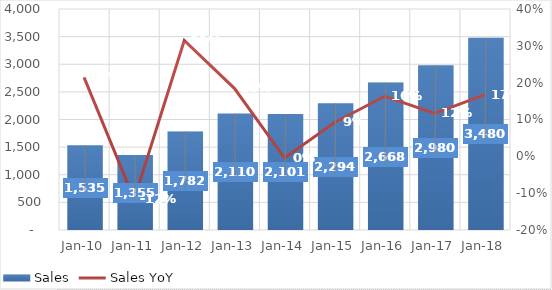
| Category | Sales |
|---|---|
| 2010-03-31 | 1534.66 |
| 2011-03-31 | 1355.29 |
| 2012-03-31 | 1781.5 |
| 2013-03-31 | 2110.4 |
| 2014-03-31 | 2100.87 |
| 2015-03-31 | 2294.33 |
| 2016-03-31 | 2668.45 |
| 2017-03-31 | 2980.22 |
| 2018-03-31 | 3480.25 |